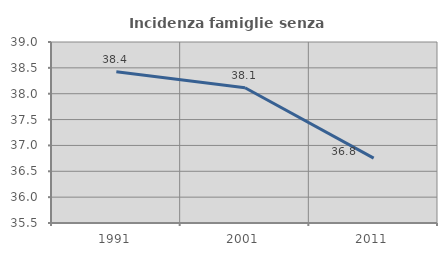
| Category | Incidenza famiglie senza nuclei |
|---|---|
| 1991.0 | 38.424 |
| 2001.0 | 38.115 |
| 2011.0 | 36.755 |